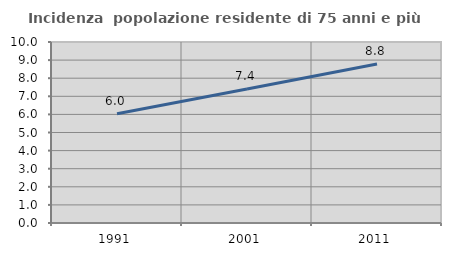
| Category | Incidenza  popolazione residente di 75 anni e più |
|---|---|
| 1991.0 | 6.037 |
| 2001.0 | 7.399 |
| 2011.0 | 8.789 |